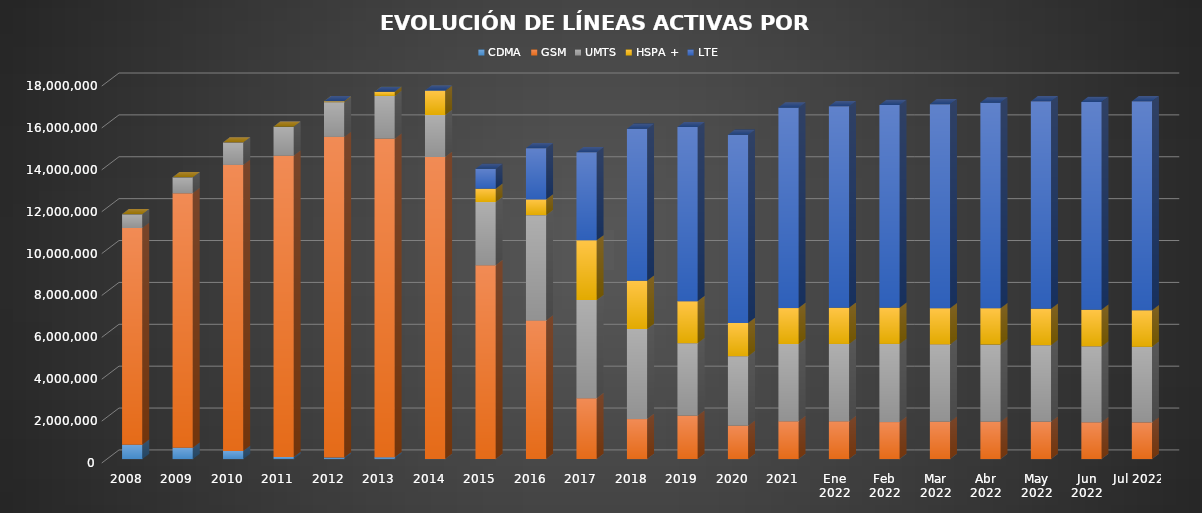
| Category | CDMA | GSM | UMTS | HSPA + | LTE |
|---|---|---|---|---|---|
| 2008 | 688357 | 10346902 | 656989 | 0 | 0 |
| 2009 | 544313 | 12151710 | 758577 | 0 | 0 |
| 2010 | 389834 | 13657394 | 1071603 | 0 | 0 |
| 2011 | 102115 | 14379423 | 1393020 | 0 | 0 |
| 2012 | 75179 | 15310006 | 1658596 | 43082 | 0 |
| 2013 | 83748 | 15215287 | 2043321 | 199398 | 0 |
| 2014 | 3009 | 14418144 | 2006405 | 1148823 | 28176 |
| 2015 | 0 | 9252920 | 3019889 | 636488 | 949723 |
| 2016 | 0 | 6621574 | 5027714 | 748032 | 2450814 |
| 2017 | 0 | 2903370.634 | 4688270.066 | 2852941.199 | 4206822.101 |
| 2018 | 0 | 1909938.891 | 4302462.415 | 2301651 | 7258785.694 |
| 2019 | 0 | 2068130.505 | 3468519.705 | 1995507 | 8320942.79 |
| 2020 | 0 | 1595680.621 | 3315009.099 | 1591073 | 8983603.28 |
| 2021 | 0 | 1804531 | 3688873 | 1717066 | 9579130 |
| Ene 2022 | 0 | 1805568.915 | 3691993.367 | 1724655 | 9625971.718 |
| Feb 2022 | 0 | 1766433.449 | 3732997.987 | 1730603 | 9675803.564 |
| Mar 2022 | 0 | 1788524.686 | 3683797.748 | 1734523 | 9742847.566 |
| Abr 2022 | 0 | 1787551.615 | 3681280.387 | 1738734 | 9820230.999 |
| May 2022 | 0 | 1778055.41 | 3660016.984 | 1744330 | 9902399.607 |
| Jun 2022 | 0 | 1757626.897 | 3624197.892 | 1745386 | 9928728.21 |
| Jul 2022 | 0 | 1753354.905 | 3606713.14 | 1747790 | 9978154.955 |